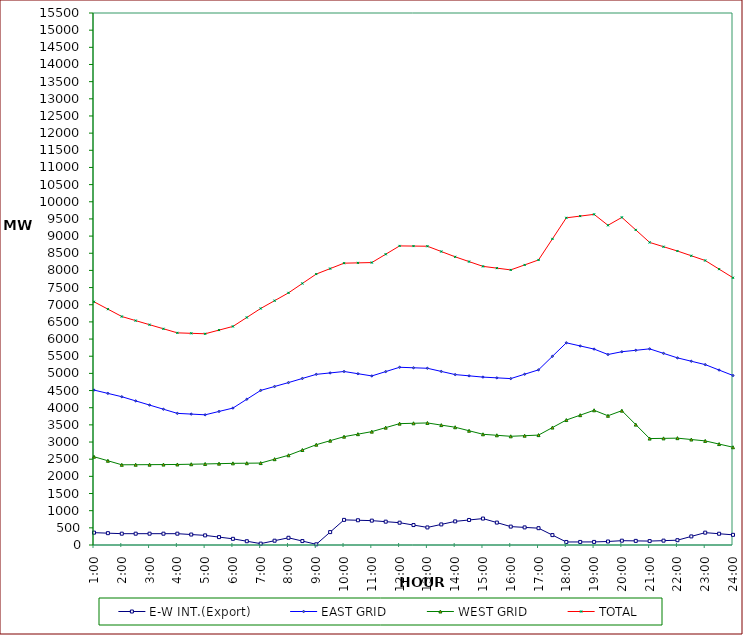
| Category | E-W INT.(Export) | EAST GRID | WEST GRID | TOTAL |
|---|---|---|---|---|
| 1:00 | 360 | 4514 | 2572 | 7086 |
| 1:30 | 345 | 4417 | 2454.5 | 6871.5 |
| 2:00 | 330 | 4320 | 2337 | 6657 |
| 2:30 | 330 | 4198.5 | 2339 | 6537.5 |
| 3:00 | 330 | 4077 | 2341 | 6418 |
| 3:30 | 330 | 3956 | 2343.5 | 6299.5 |
| 4:00 | 330 | 3835 | 2346 | 6181 |
| 4:30 | 305 | 3814 | 2353.5 | 6167.5 |
| 5:00 | 280 | 3793 | 2361 | 6154 |
| 5:30 | 230 | 3891 | 2370 | 6261 |
| 6:00 | 180 | 3989 | 2379 | 6368 |
| 6:30 | 110 | 4246.5 | 2383 | 6629.5 |
| 7:00 | 40 | 4504 | 2387 | 6891 |
| 7:30 | 125 | 4618 | 2500.5 | 7118.5 |
| 8:00 | 210 | 4732 | 2614 | 7346 |
| 8:30 | 115 | 4852 | 2768 | 7620 |
| 9:00 | 20 | 4972 | 2922 | 7894 |
| 9:30 | 376 | 5013.5 | 3039 | 8052.5 |
| 10:00 | 732 | 5055 | 3156 | 8211 |
| 10:30 | 721 | 4990.5 | 3229.5 | 8220 |
| 11:00 | 710 | 4926 | 3303 | 8229 |
| 11:30 | 680 | 5052 | 3419.5 | 8471.5 |
| 12:00 | 650 | 5178 | 3536 | 8714 |
| 12:30 | 581 | 5163.5 | 3546 | 8709.5 |
| 13:00 | 512 | 5149 | 3556 | 8705 |
| 13:30 | 600 | 5057 | 3493.5 | 8550.5 |
| 14:00 | 688 | 4965 | 3431 | 8396 |
| 14:30 | 729 | 4928.5 | 3328.5 | 8257 |
| 15:00 | 770 | 4892 | 3226 | 8118 |
| 15:30 | 653 | 4870 | 3196.5 | 8066.5 |
| 16:00 | 536 | 4848 | 3167 | 8015 |
| 16:30 | 513 | 4975.5 | 3184.5 | 8160 |
| 17:00 | 490 | 5103 | 3202 | 8305 |
| 17:30 | 289 | 5497 | 3421.5 | 8918.5 |
| 18:00 | 88 | 5891 | 3641 | 9532 |
| 18:30 | 89 | 5799.5 | 3783 | 9582.5 |
| 19:00 | 90 | 5708 | 3925 | 9633 |
| 19:30 | 102 | 5550 | 3765 | 9315 |
| 20:00 | 126 | 5631 | 3914 | 9545 |
| 20:30 | 120 | 5673 | 3507.5 | 9180.5 |
| 21:00 | 114 | 5715 | 3101 | 8816 |
| 21:30 | 127 | 5583.5 | 3107 | 8690.5 |
| 22:00 | 140 | 5452 | 3113 | 8565 |
| 22:30 | 250 | 5354 | 3073 | 8427 |
| 23:00 | 360 | 5256 | 3033 | 8289 |
| 23:30 | 328 | 5097 | 2940.5 | 8037.5 |
| 24:00 | 296 | 4938 | 2848 | 7786 |